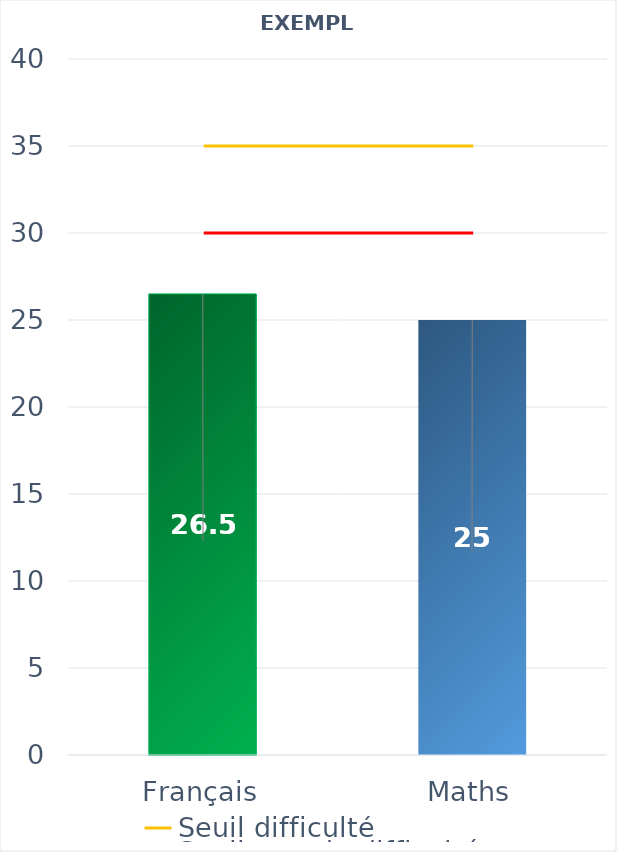
| Category | Résultats élève |
|---|---|
| Français | 26.5 |
| Maths | 25 |